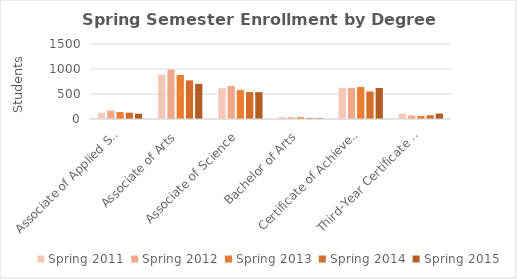
| Category | Spring 2011 | Spring 2012 | Spring 2013 | Spring 2014 | Spring 2015 |
|---|---|---|---|---|---|
| Associate of Applied Science | 121 | 167 | 139 | 127 | 106 |
| Associate of Arts | 884 | 985 | 880 | 773 | 704 |
| Associate of Science | 616 | 659 | 578 | 539 | 538 |
| Bachelor of Arts | 38 | 36 | 35 | 22 | 17 |
| Certificate of Achievement | 624 | 622 | 641 | 551 | 620 |
| Third-Year Certificate of Achievement | 106 | 71 | 61 | 75 | 109 |